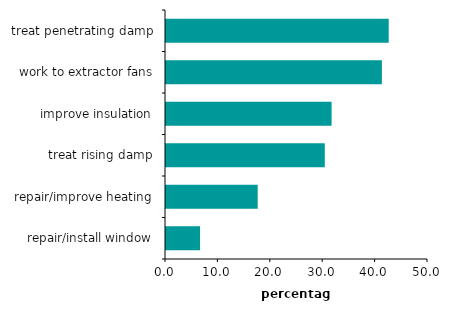
| Category | Series 0 |
|---|---|
| treat penetrating damp | 42.5 |
| work to extractor fans | 41.2 |
| improve insulation | 31.6 |
| treat rising damp | 30.3 |
| repair/improve heating | 17.5 |
| repair/install window | 6.5 |